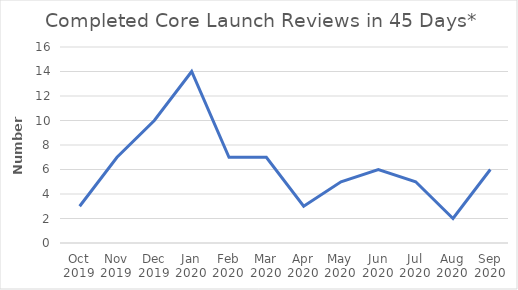
| Category | Number |
|---|---|
| Oct 2019 | 3 |
| Nov 2019 | 7 |
| Dec 2019 | 10 |
| Jan 2020 | 14 |
| Feb 2020 | 7 |
| Mar 2020 | 7 |
| Apr 2020 | 3 |
| May 2020 | 5 |
| Jun 2020 | 6 |
| Jul 2020 | 5 |
| Aug 2020 | 2 |
| Sep 2020 | 6 |